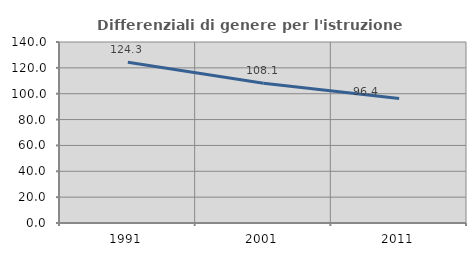
| Category | Differenziali di genere per l'istruzione superiore |
|---|---|
| 1991.0 | 124.317 |
| 2001.0 | 108.088 |
| 2011.0 | 96.351 |